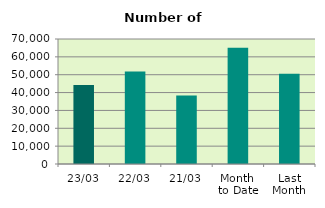
| Category | Series 0 |
|---|---|
| 23/03 | 44218 |
| 22/03 | 51830 |
| 21/03 | 38298 |
| Month 
to Date | 65065.765 |
| Last
Month | 50484.7 |